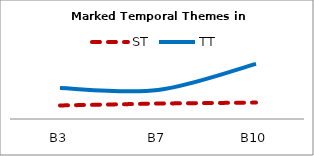
| Category | ST | TT |
|---|---|---|
| B3 | 14 | 32 |
| B7 | 16 | 30 |
| B10 | 17 | 57 |